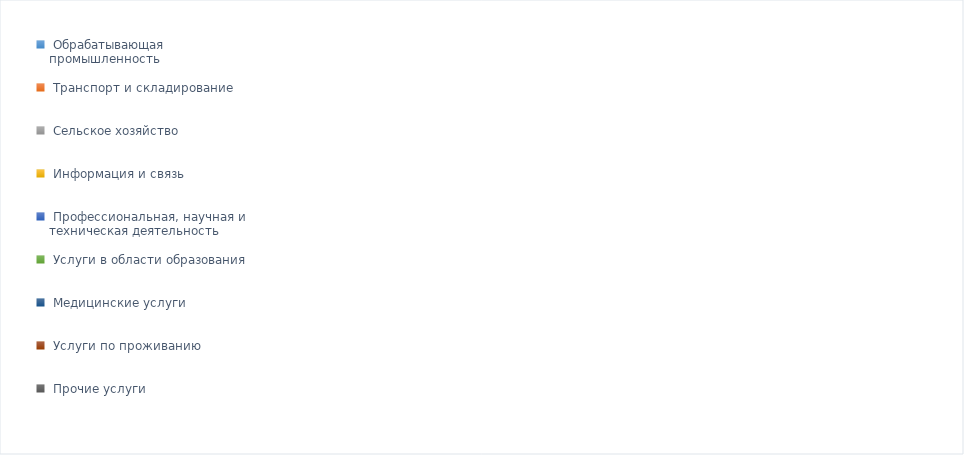
| Category | Series 0 |
|---|---|
| Обрабатывающая промышленность | 0.393 |
| Транспорт и складирование | 0.14 |
| Сельское хозяйство | 0.085 |
| Информация и связь | 0.007 |
| Профессиональная, научная и техническая деятельность | 0.014 |
| Услуги в области образования | 0.052 |
| Медицинские услуги | 0.067 |
| Услуги по проживанию | 0.054 |
| Прочие услуги | 0.19 |